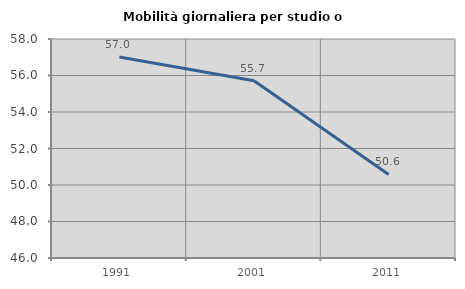
| Category | Mobilità giornaliera per studio o lavoro |
|---|---|
| 1991.0 | 57.017 |
| 2001.0 | 55.716 |
| 2011.0 | 50.578 |